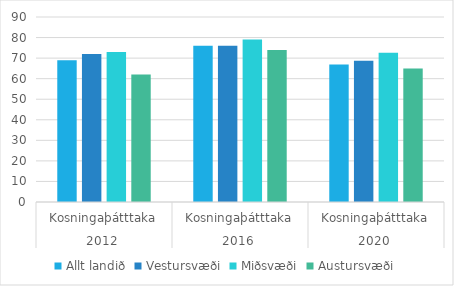
| Category | Allt landið | Vestursvæði | Miðsvæði | Austursvæði |
|---|---|---|---|---|
| 0 | 69 | 72 | 73 | 62 |
| 1 | 76 | 76 | 79 | 74 |
| 2 | 66.9 | 68.77 | 72.604 | 64.894 |